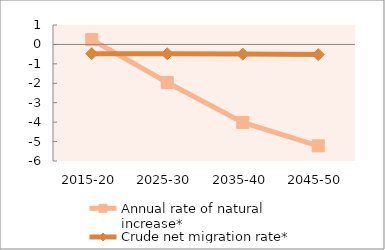
| Category | Annual rate of natural increase* | Crude net migration rate* |
|---|---|---|
| 2015-20 | 0.247 | -0.474 |
| 2025-30 | -1.957 | -0.48 |
| 2035-40 | -4.012 | -0.498 |
| 2045-50 | -5.219 | -0.524 |